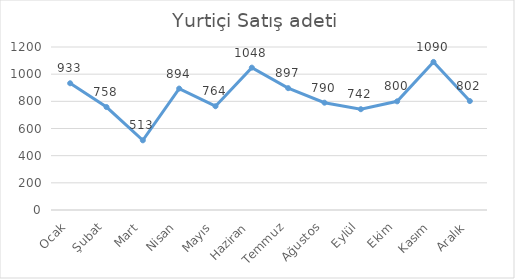
| Category | Yurtiçi Satış adeti |
|---|---|
| Ocak | 933 |
| Şubat | 758 |
| Mart | 513 |
| Nisan | 894 |
| Mayıs | 764 |
| Haziran | 1048 |
| Temmuz | 897 |
| Ağustos | 790 |
| Eylül | 742 |
| Ekim | 800 |
| Kasım | 1090 |
| Aralık | 802 |